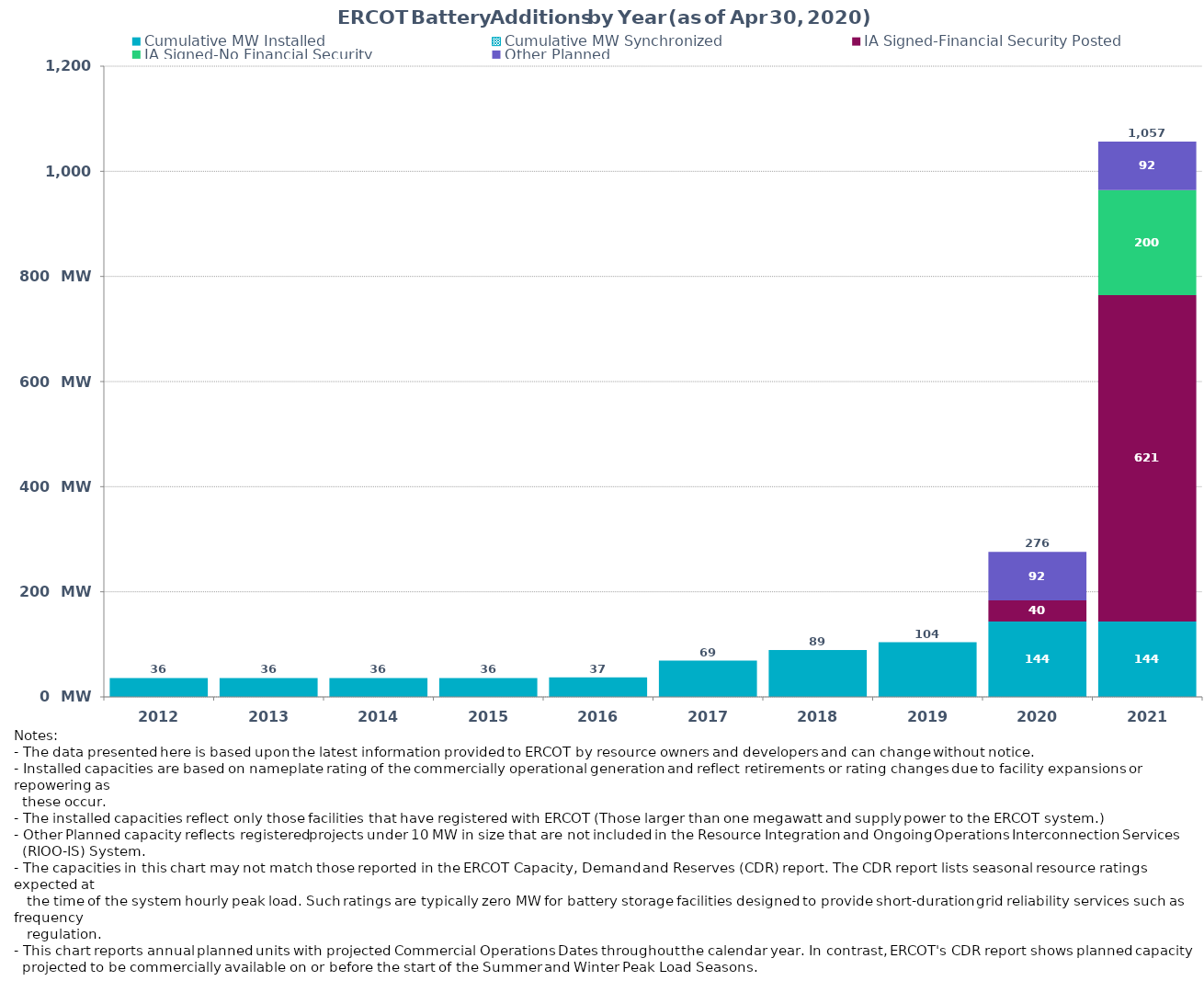
| Category | Cumulative MW Installed | Cumulative MW Synchronized | IA Signed-Financial Security Posted  | IA Signed-No Financial Security  | Other Planned | Cumulative Installed and Planned |
|---|---|---|---|---|---|---|
| 2012.0 | 36 | 0 | 0 | 0 | 0 | 36 |
| 2013.0 | 36 | 0 | 0 | 0 | 0 | 36 |
| 2014.0 | 36 | 0 | 0 | 0 | 0 | 36 |
| 2015.0 | 36 | 0 | 0 | 0 | 0 | 36 |
| 2016.0 | 37 | 0 | 0 | 0 | 0 | 37 |
| 2017.0 | 69 | 0 | 0 | 0 | 0 | 69 |
| 2018.0 | 89 | 0 | 0 | 0 | 0 | 89 |
| 2019.0 | 104 | 0 | 0 | 0 | 0 | 104 |
| 2020.0 | 143.5 | 0 | 40.26 | 0 | 92 | 275.76 |
| 2021.0 | 143.5 | 0 | 621 | 200 | 92 | 1056.5 |